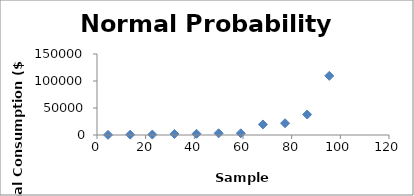
| Category | Series 0 |
|---|---|
| 4.545454545454546 | 276 |
| 13.636363636363637 | 622 |
| 22.72727272727273 | 836 |
| 31.81818181818182 | 1913 |
| 40.909090909090914 | 2195 |
| 50.00000000000001 | 3145 |
| 59.09090909090909 | 3154 |
| 68.18181818181819 | 19539 |
| 77.27272727272728 | 21785 |
| 86.36363636363637 | 37931 |
| 95.45454545454547 | 109521 |